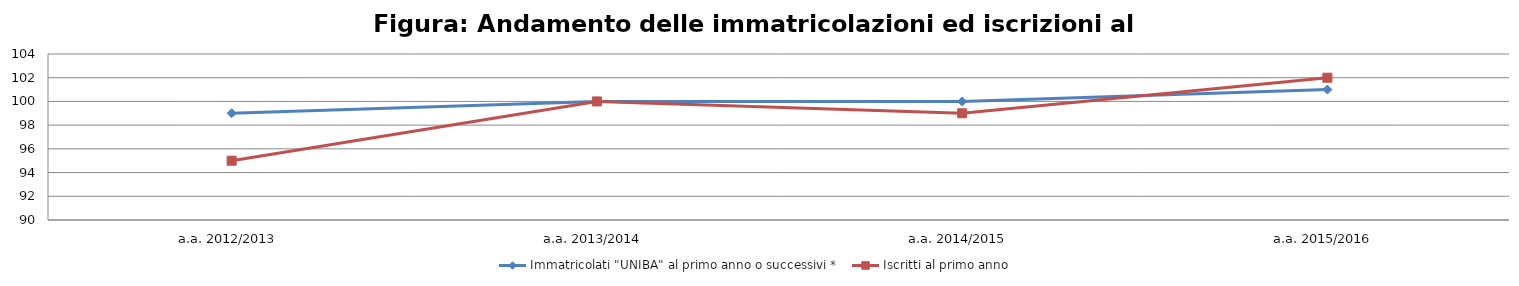
| Category | Immatricolati "UNIBA" al primo anno o successivi * | Iscritti al primo anno  |
|---|---|---|
| a.a. 2012/2013 | 99 | 95 |
| a.a. 2013/2014 | 100 | 100 |
| a.a. 2014/2015 | 100 | 99 |
| a.a. 2015/2016 | 101 | 102 |